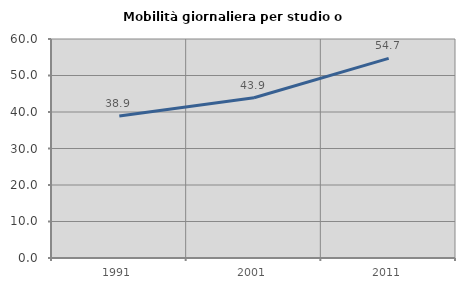
| Category | Mobilità giornaliera per studio o lavoro |
|---|---|
| 1991.0 | 38.889 |
| 2001.0 | 43.902 |
| 2011.0 | 54.688 |